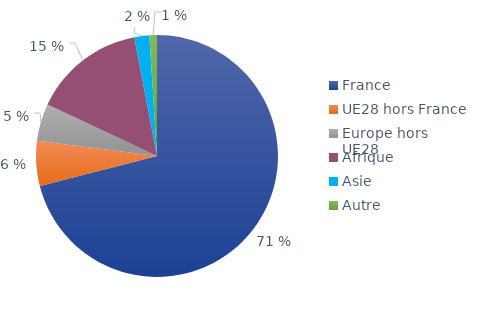
| Category | Series 0 |
|---|---|
| France | 0.71 |
| UE28 hors France | 0.06 |
| Europe hors UE28 | 0.05 |
| Afrique | 0.15 |
| Asie | 0.02 |
| Autre | 0.01 |